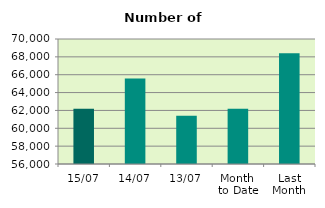
| Category | Series 0 |
|---|---|
| 15/07 | 62188 |
| 14/07 | 65568 |
| 13/07 | 61398 |
| Month 
to Date | 62191.091 |
| Last
Month | 68392.182 |